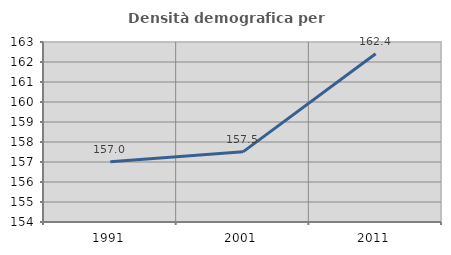
| Category | Densità demografica |
|---|---|
| 1991.0 | 157.017 |
| 2001.0 | 157.507 |
| 2011.0 | 162.414 |